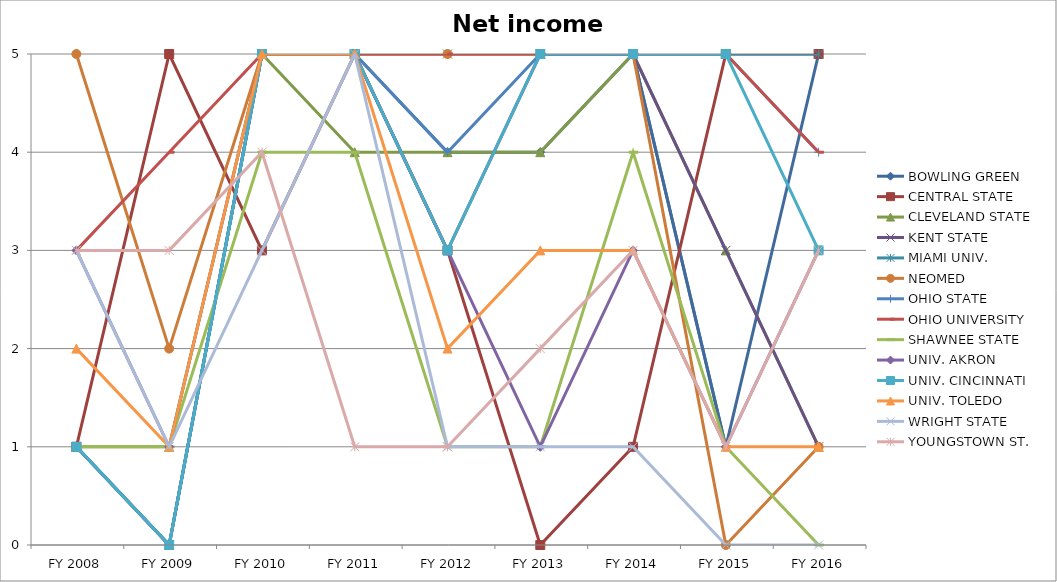
| Category | BOWLING GREEN  | CENTRAL STATE  | CLEVELAND STATE  | KENT STATE  | MIAMI UNIV.  | NEOMED  | OHIO STATE  | OHIO UNIVERSITY  | SHAWNEE STATE  | UNIV. AKRON  | UNIV. CINCINNATI  | UNIV. TOLEDO  | WRIGHT STATE  | YOUNGSTOWN ST.  |
|---|---|---|---|---|---|---|---|---|---|---|---|---|---|---|
| FY 2016 | 5 | 5 | 1 | 1 | 5 | 1 | 4 | 4 | 0 | 3 | 3 | 1 | 0 | 3 |
| FY 2015 | 1 | 5 | 3 | 3 | 5 | 0 | 5 | 5 | 1 | 1 | 5 | 1 | 0 | 1 |
| FY 2014 | 5 | 1 | 5 | 5 | 5 | 5 | 5 | 5 | 4 | 3 | 5 | 3 | 1 | 3 |
| FY 2013 | 4 | 0 | 4 | 5 | 5 | 5 | 5 | 5 | 1 | 1 | 5 | 3 | 1 | 2 |
| FY 2012 | 4 | 3 | 4 | 3 | 5 | 5 | 4 | 5 | 1 | 3 | 3 | 2 | 1 | 1 |
| FY 2011 | 5 | 5 | 4 | 5 | 5 | 5 | 5 | 5 | 4 | 5 | 5 | 5 | 5 | 1 |
| FY 2010 | 5 | 3 | 5 | 5 | 5 | 5 | 5 | 5 | 4 | 5 | 5 | 5 | 3 | 4 |
| FY 2009 | 0 | 5 | 1 | 0 | 0 | 2 | 0 | 4 | 1 | 1 | 0 | 1 | 1 | 3 |
| FY 2008 | 1 | 1 | 1 | 1 | 1 | 5 | 1 | 3 | 1 | 3 | 1 | 2 | 3 | 3 |